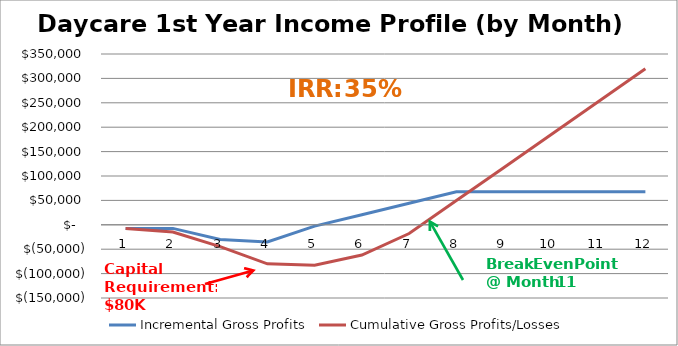
| Category | Incremental Gross Profits | Cumulative Gross Profits/Losses |
|---|---|---|
| 0 | -7386.967 | -7386.967 |
| 1 | -7386.967 | -14773.933 |
| 2 | -29886.967 | -44660.9 |
| 3 | -35326.967 | -79987.867 |
| 4 | -2705.767 | -82693.633 |
| 5 | 20694.233 | -61999.4 |
| 6 | 44094.233 | -17905.167 |
| 7 | 67494.233 | 49589.067 |
| 8 | 67494.233 | 117083.3 |
| 9 | 67494.233 | 184577.533 |
| 10 | 67494.233 | 252071.767 |
| 11 | 67494.233 | 319566 |